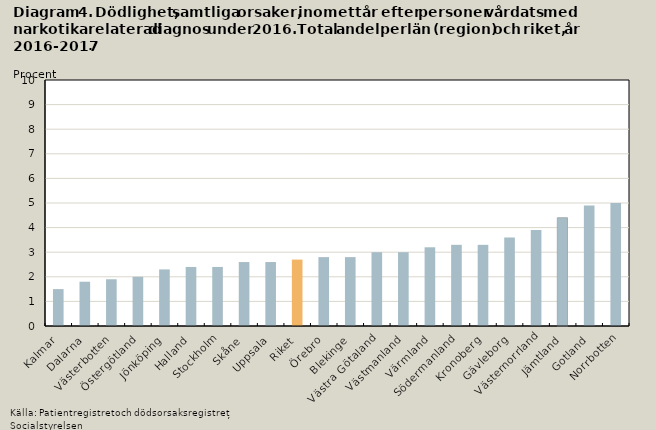
| Category | Total |
|---|---|
| Kalmar | 1.5 |
| Dalarna | 1.8 |
| Västerbotten | 1.9 |
| Östergötland | 2 |
| Jönköping | 2.3 |
| Halland | 2.4 |
| Stockholm | 2.4 |
| Skåne | 2.6 |
| Uppsala | 2.6 |
| Riket | 2.7 |
| Örebro | 2.8 |
| Blekinge | 2.8 |
| Västra Götaland | 3 |
| Västmanland | 3 |
| Värmland | 3.2 |
| Södermanland | 3.3 |
| Kronoberg | 3.3 |
| Gävleborg | 3.6 |
| Västernorrland | 3.9 |
| Jämtland | 4.4 |
| Gotland | 4.9 |
| Norrbotten | 5 |